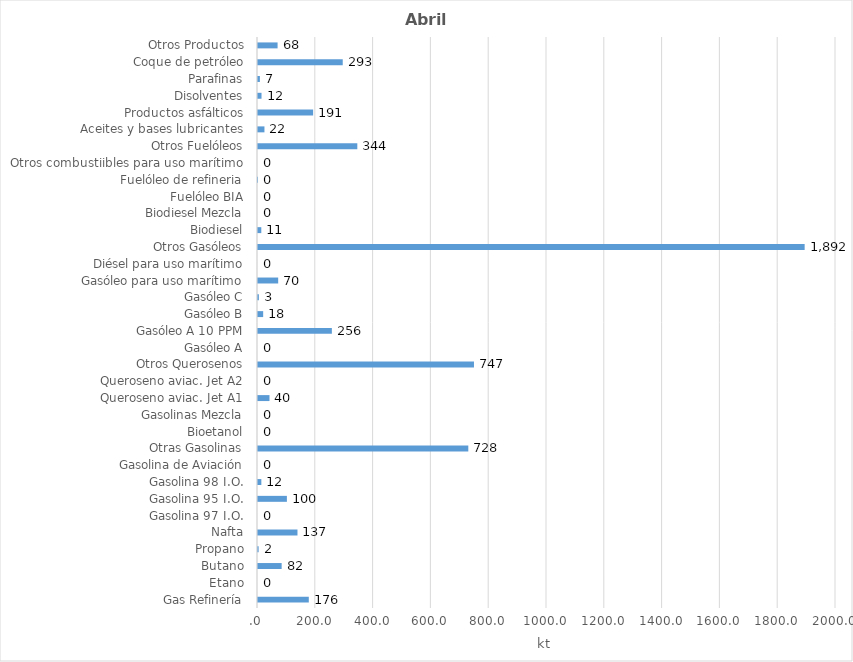
| Category | Series 0 |
|---|---|
| Gas Refinería | 175.762 |
| Etano | 0 |
| Butano | 81.85 |
| Propano | 2.174 |
| Nafta | 136.59 |
| Gasolina 97 I.O. | 0 |
| Gasolina 95 I.O. | 99.983 |
| Gasolina 98 I.O. | 11.562 |
| Gasolina de Aviación | 0 |
| Otras Gasolinas | 727.696 |
| Bioetanol | 0 |
| Gasolinas Mezcla | 0 |
| Queroseno aviac. Jet A1 | 39.786 |
| Queroseno aviac. Jet A2 | 0 |
| Otros Querosenos | 747.343 |
| Gasóleo A | 0 |
| Gasóleo A 10 PPM | 255.571 |
| Gasóleo B | 17.908 |
| Gasóleo C | 3.024 |
| Gasóleo para uso marítimo | 69.869 |
| Diésel para uso marítimo | 0 |
| Otros Gasóleos | 1891.507 |
| Biodiesel | 11.42 |
| Biodiesel Mezcla | 0 |
| Fuelóleo BIA | 0 |
| Fuelóleo de refineria | 0.039 |
| Otros combustiibles para uso marítimo | 0 |
| Otros Fuelóleos | 343.664 |
| Aceites y bases lubricantes | 22.325 |
| Productos asfálticos | 190.78 |
| Disolventes | 12.172 |
| Parafinas | 6.554 |
| Coque de petróleo | 293.216 |
| Otros Productos | 67.786 |